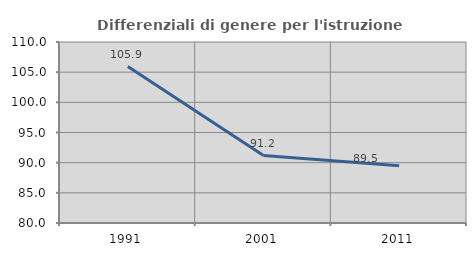
| Category | Differenziali di genere per l'istruzione superiore |
|---|---|
| 1991.0 | 105.922 |
| 2001.0 | 91.183 |
| 2011.0 | 89.502 |